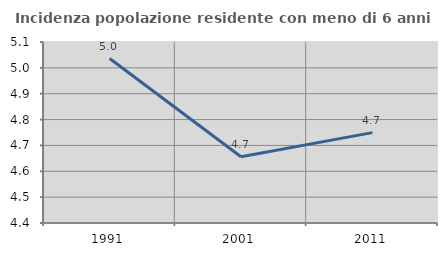
| Category | Incidenza popolazione residente con meno di 6 anni |
|---|---|
| 1991.0 | 5.036 |
| 2001.0 | 4.656 |
| 2011.0 | 4.75 |